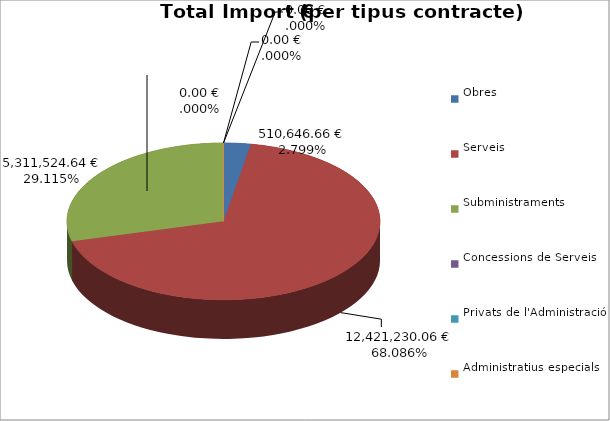
| Category | Total preu
(amb IVA) |
|---|---|
| Obres | 510646.662 |
| Serveis | 12421230.056 |
| Subministraments | 5311524.642 |
| Concessions de Serveis | 0 |
| Privats de l'Administració | 0 |
| Administratius especials | 0 |